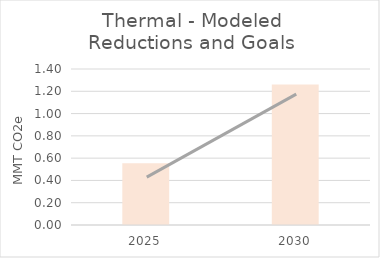
| Category | Thermal |
|---|---|
| 2025.0 | 0.555 |
| 2030.0 | 1.262 |